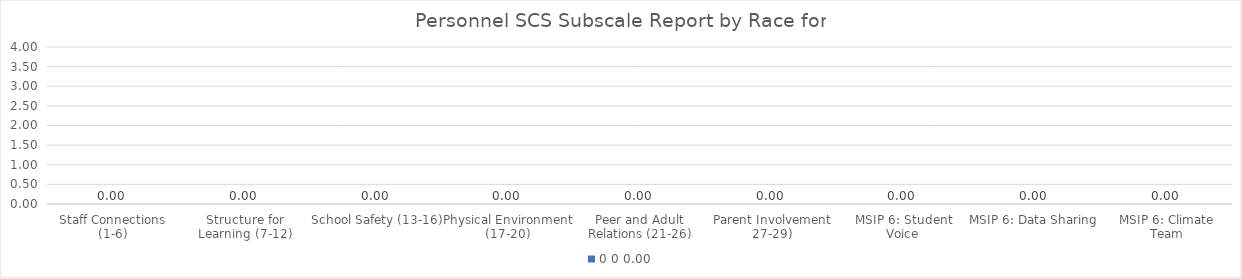
| Category | 0 |
|---|---|
| Staff Connections (1-6) | 0 |
| Structure for Learning (7-12) | 0 |
| School Safety (13-16) | 0 |
| Physical Environment (17-20) | 0 |
| Peer and Adult Relations (21-26) | 0 |
| Parent Involvement 27-29) | 0 |
| MSIP 6: Student Voice | 0 |
| MSIP 6: Data Sharing | 0 |
| MSIP 6: Climate Team | 0 |